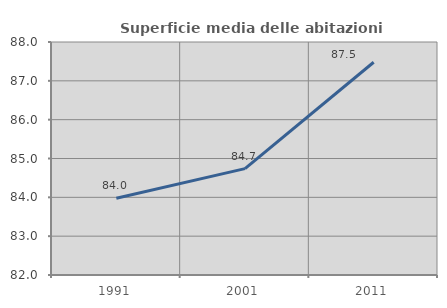
| Category | Superficie media delle abitazioni occupate |
|---|---|
| 1991.0 | 83.978 |
| 2001.0 | 84.739 |
| 2011.0 | 87.479 |